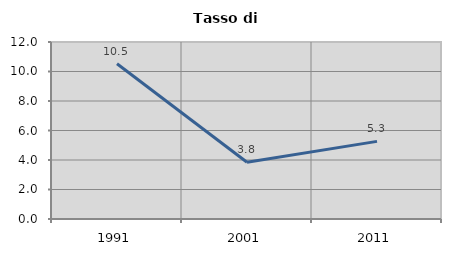
| Category | Tasso di disoccupazione   |
|---|---|
| 1991.0 | 10.526 |
| 2001.0 | 3.846 |
| 2011.0 | 5.263 |